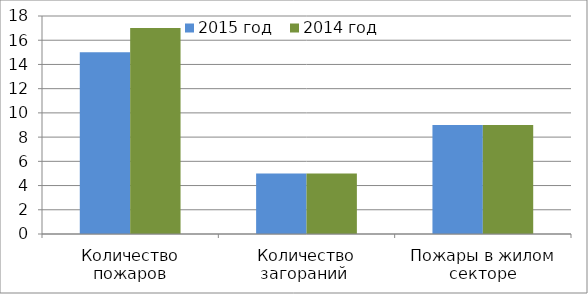
| Category | 2015 год | 2014 год |
|---|---|---|
| Количество пожаров | 15 | 17 |
| Количество загораний  | 5 | 5 |
| Пожары в жилом секторе | 9 | 9 |